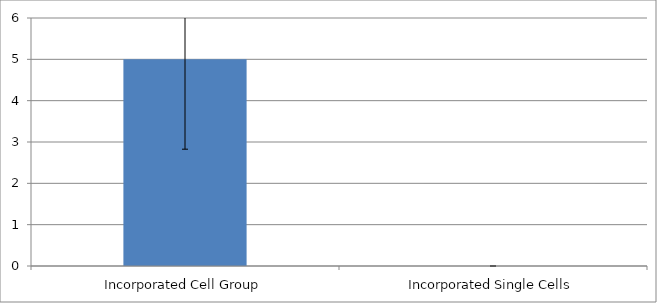
| Category | Series 0 |
|---|---|
| Incorporated Cell Group | 5.002 |
| Incorporated Single Cells | 0 |